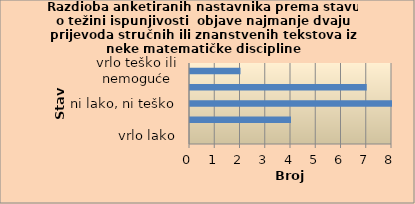
| Category | Series 0 |
|---|---|
| vrlo lako | 0 |
| lako | 4 |
| ni lako, ni teško | 8 |
| teško | 7 |
| vrlo teško ili nemoguće | 2 |